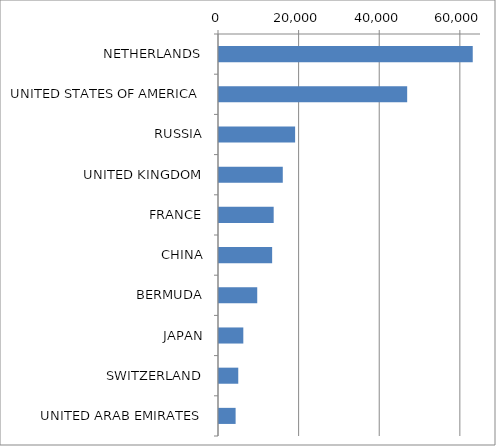
| Category | Series 0 |
|---|---|
| NETHERLANDS | 62950.336 |
| UNITED STATES OF AMERICA | 46683.973 |
| RUSSIA | 18884.733 |
| UNITED KINGDOM | 15823.284 |
| FRANCE | 13566.099 |
| CHINA | 13183.455 |
| BERMUDA | 9485.496 |
| JAPAN | 6032.468 |
| SWITZERLAND | 4778.505 |
| UNITED ARAB EMIRATES | 4121.635 |